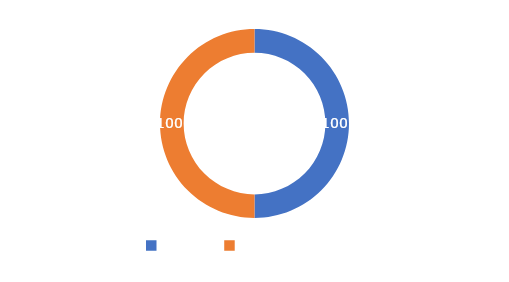
| Category | Series 0 |
|---|---|
| META  | 100 |
| CUMPLIMIENTO | 100 |